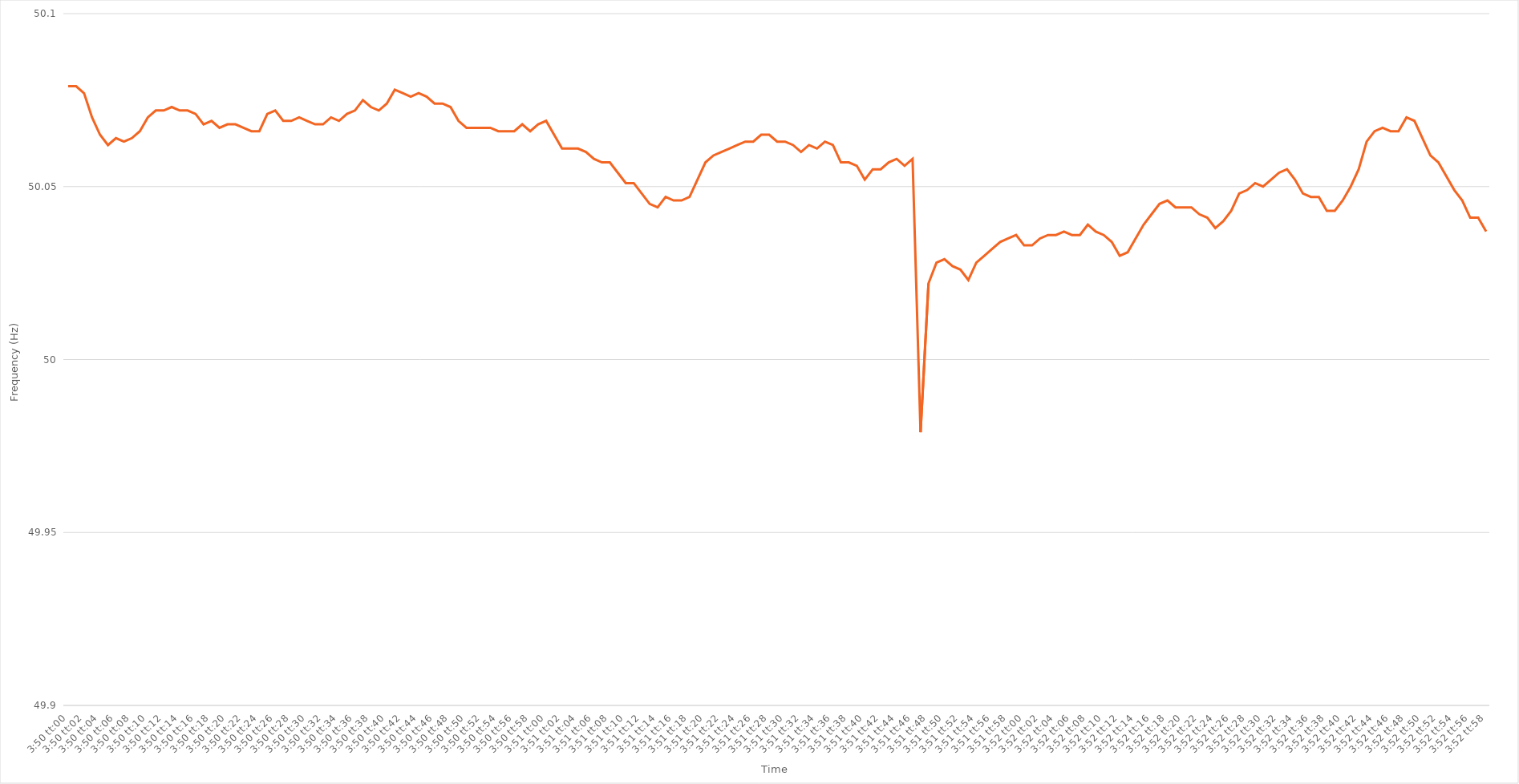
| Category | Series 0 |
|---|---|
| 0.15972222222222224 | 50.079 |
| 0.15973379629629628 | 50.079 |
| 0.15974537037037037 | 50.077 |
| 0.15975694444444444 | 50.07 |
| 0.1597685185185185 | 50.065 |
| 0.1597800925925926 | 50.062 |
| 0.15979166666666667 | 50.064 |
| 0.15980324074074073 | 50.063 |
| 0.15981481481481483 | 50.064 |
| 0.1598263888888889 | 50.066 |
| 0.15983796296296296 | 50.07 |
| 0.15984953703703705 | 50.072 |
| 0.15986111111111112 | 50.072 |
| 0.1598726851851852 | 50.073 |
| 0.15988425925925925 | 50.072 |
| 0.15989583333333332 | 50.072 |
| 0.15990740740740741 | 50.071 |
| 0.15991898148148148 | 50.068 |
| 0.15993055555555555 | 50.069 |
| 0.15994212962962964 | 50.067 |
| 0.1599537037037037 | 50.068 |
| 0.15996527777777778 | 50.068 |
| 0.15997685185185184 | 50.067 |
| 0.1599884259259259 | 50.066 |
| 0.16 | 50.066 |
| 0.16001157407407407 | 50.071 |
| 0.16002314814814814 | 50.072 |
| 0.16003472222222223 | 50.069 |
| 0.1600462962962963 | 50.069 |
| 0.16005787037037036 | 50.07 |
| 0.16006944444444446 | 50.069 |
| 0.16008101851851853 | 50.068 |
| 0.1600925925925926 | 50.068 |
| 0.16010416666666666 | 50.07 |
| 0.16011574074074075 | 50.069 |
| 0.16012731481481482 | 50.071 |
| 0.1601388888888889 | 50.072 |
| 0.16015046296296295 | 50.075 |
| 0.16016203703703705 | 50.073 |
| 0.1601736111111111 | 50.072 |
| 0.16018518518518518 | 50.074 |
| 0.16019675925925925 | 50.078 |
| 0.16020833333333334 | 50.077 |
| 0.1602199074074074 | 50.076 |
| 0.16023148148148147 | 50.077 |
| 0.16024305555555554 | 50.076 |
| 0.16025462962962964 | 50.074 |
| 0.1602662037037037 | 50.074 |
| 0.16027777777777777 | 50.073 |
| 0.16028935185185186 | 50.069 |
| 0.16030092592592593 | 50.067 |
| 0.1603125 | 50.067 |
| 0.1603240740740741 | 50.067 |
| 0.16033564814814816 | 50.067 |
| 0.16034722222222222 | 50.066 |
| 0.1603587962962963 | 50.066 |
| 0.16037037037037036 | 50.066 |
| 0.16038194444444445 | 50.068 |
| 0.16039351851851852 | 50.066 |
| 0.16040509259259259 | 50.068 |
| 0.16041666666666668 | 50.069 |
| 0.16042824074074075 | 50.065 |
| 0.1604398148148148 | 50.061 |
| 0.16045138888888888 | 50.061 |
| 0.16046296296296295 | 50.061 |
| 0.16047453703703704 | 50.06 |
| 0.1604861111111111 | 50.058 |
| 0.16049768518518517 | 50.057 |
| 0.16050925925925927 | 50.057 |
| 0.16052083333333333 | 50.054 |
| 0.1605324074074074 | 50.051 |
| 0.1605439814814815 | 50.051 |
| 0.16055555555555556 | 50.048 |
| 0.16056712962962963 | 50.045 |
| 0.16057870370370372 | 50.044 |
| 0.16059027777777776 | 50.047 |
| 0.16060185185185186 | 50.046 |
| 0.16061342592592592 | 50.046 |
| 0.160625 | 50.047 |
| 0.16063657407407408 | 50.052 |
| 0.16064814814814815 | 50.057 |
| 0.16065972222222222 | 50.059 |
| 0.1606712962962963 | 50.06 |
| 0.16068287037037035 | 50.061 |
| 0.16069444444444445 | 50.062 |
| 0.1607060185185185 | 50.063 |
| 0.16071759259259258 | 50.063 |
| 0.16072916666666667 | 50.065 |
| 0.16074074074074074 | 50.065 |
| 0.1607523148148148 | 50.063 |
| 0.1607638888888889 | 50.063 |
| 0.16077546296296297 | 50.062 |
| 0.16078703703703703 | 50.06 |
| 0.16079861111111113 | 50.062 |
| 0.1608101851851852 | 50.061 |
| 0.16082175925925926 | 50.063 |
| 0.16083333333333333 | 50.062 |
| 0.1608449074074074 | 50.057 |
| 0.1608564814814815 | 50.057 |
| 0.16086805555555556 | 50.056 |
| 0.16087962962962962 | 50.052 |
| 0.16089120370370372 | 50.055 |
| 0.16090277777777778 | 50.055 |
| 0.16091435185185185 | 50.057 |
| 0.16092592592592592 | 50.058 |
| 0.16093749999999998 | 50.056 |
| 0.16094907407407408 | 50.058 |
| 0.16096064814814814 | 49.979 |
| 0.1609722222222222 | 50.022 |
| 0.1609837962962963 | 50.028 |
| 0.16099537037037037 | 50.029 |
| 0.16100694444444444 | 50.027 |
| 0.16101851851851853 | 50.026 |
| 0.1610300925925926 | 50.023 |
| 0.16104166666666667 | 50.028 |
| 0.16105324074074073 | 50.03 |
| 0.1610648148148148 | 50.032 |
| 0.1610763888888889 | 50.034 |
| 0.16108796296296296 | 50.035 |
| 0.16109953703703703 | 50.036 |
| 0.16111111111111112 | 50.033 |
| 0.1611226851851852 | 50.033 |
| 0.16113425925925925 | 50.035 |
| 0.16114583333333332 | 50.036 |
| 0.16115740740740742 | 50.036 |
| 0.16116898148148148 | 50.037 |
| 0.16118055555555555 | 50.036 |
| 0.16119212962962962 | 50.036 |
| 0.1612037037037037 | 50.039 |
| 0.16121527777777778 | 50.037 |
| 0.16122685185185184 | 50.036 |
| 0.16123842592592594 | 50.034 |
| 0.16125 | 50.03 |
| 0.16126157407407407 | 50.031 |
| 0.16127314814814817 | 50.035 |
| 0.16128472222222223 | 50.039 |
| 0.1612962962962963 | 50.042 |
| 0.16130787037037037 | 50.045 |
| 0.16131944444444443 | 50.046 |
| 0.16133101851851853 | 50.044 |
| 0.1613425925925926 | 50.044 |
| 0.16135416666666666 | 50.044 |
| 0.16136574074074075 | 50.042 |
| 0.16137731481481482 | 50.041 |
| 0.1613888888888889 | 50.038 |
| 0.16140046296296295 | 50.04 |
| 0.16141203703703702 | 50.043 |
| 0.16142361111111111 | 50.048 |
| 0.16143518518518518 | 50.049 |
| 0.16144675925925925 | 50.051 |
| 0.16145833333333334 | 50.05 |
| 0.1614699074074074 | 50.052 |
| 0.16148148148148148 | 50.054 |
| 0.16149305555555557 | 50.055 |
| 0.16150462962962964 | 50.052 |
| 0.1615162037037037 | 50.048 |
| 0.1615277777777778 | 50.047 |
| 0.16153935185185184 | 50.047 |
| 0.16155092592592593 | 50.043 |
| 0.1615625 | 50.043 |
| 0.16157407407407406 | 50.046 |
| 0.16158564814814816 | 50.05 |
| 0.16159722222222223 | 50.055 |
| 0.1616087962962963 | 50.063 |
| 0.1616203703703704 | 50.066 |
| 0.16163194444444443 | 50.067 |
| 0.16164351851851852 | 50.066 |
| 0.1616550925925926 | 50.066 |
| 0.16166666666666665 | 50.07 |
| 0.16167824074074075 | 50.069 |
| 0.16168981481481481 | 50.064 |
| 0.16170138888888888 | 50.059 |
| 0.16171296296296298 | 50.057 |
| 0.16172453703703704 | 50.053 |
| 0.1617361111111111 | 50.049 |
| 0.1617476851851852 | 50.046 |
| 0.16175925925925924 | 50.041 |
| 0.16177083333333334 | 50.041 |
| 0.1617824074074074 | 50.037 |